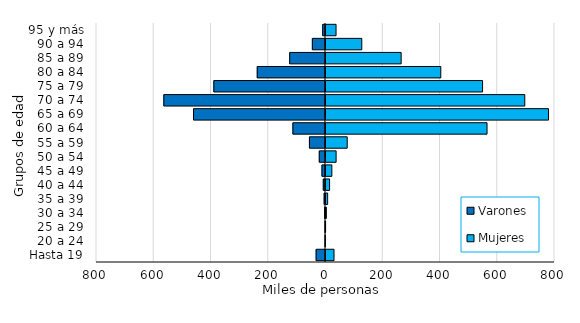
| Category | Varones | Mujeres |
|---|---|---|
| Hasta 19 | -32682 | 31459 |
| 20 a 24 | -910 | 880 |
| 25 a 29 | -1455 | 2076 |
| 30 a 34 | -2480 | 4741 |
| 35 a 39 | -4683 | 9234 |
| 40 a 44 | -7739 | 15995 |
| 45 a 49 | -12302 | 23921 |
| 50 a 54 | -21718 | 38858 |
| 55 a 59 | -56068 | 77599 |
| 60 a 64 | -113857 | 566057 |
| 65 a 69 | -461120 | 780913 |
| 70 a 74 | -564771 | 697935 |
| 75 a 79 | -390014 | 550445 |
| 80 a 84 | -238416 | 404493 |
| 85 a 89 | -125023 | 266063 |
| 90 a 94 | -45855 | 128519 |
| 95 y más | -9798 | 38631 |